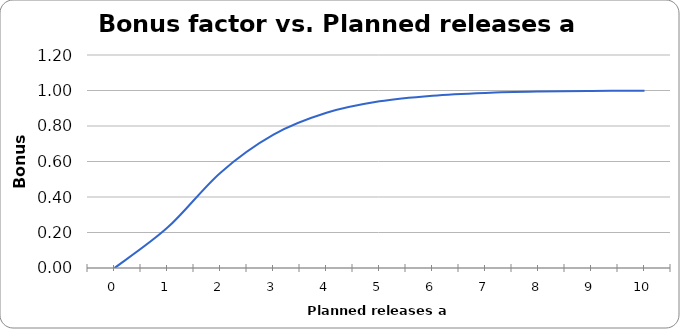
| Category | Bonus factor |
|---|---|
| 0.0 | 0 |
| 1.0 | 0.228 |
| 2.0 | 0.537 |
| 3.0 | 0.751 |
| 4.0 | 0.874 |
| 5.0 | 0.939 |
| 6.0 | 0.971 |
| 7.0 | 0.987 |
| 8.0 | 0.994 |
| 9.0 | 0.997 |
| 10.0 | 0.999 |